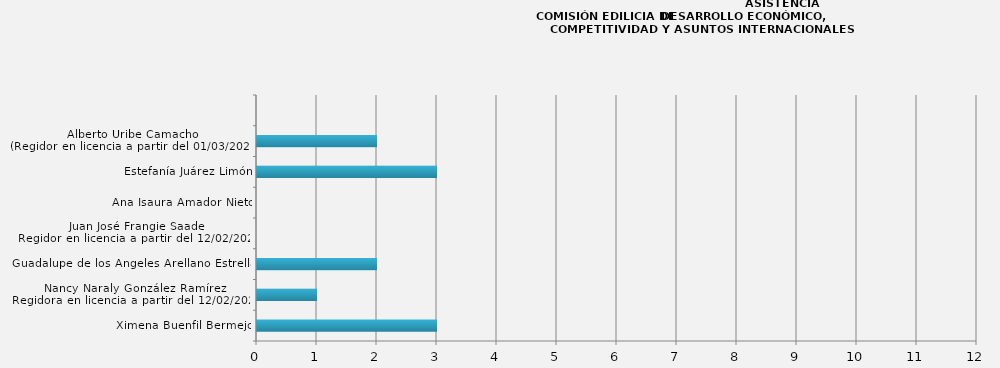
| Category | Ximena Buenfil Bermejo |
|---|---|
| Ximena Buenfil Bermejo | 3 |
| Nancy Naraly González Ramírez
Regidora en licencia a partir del 12/02/2024 | 1 |
| Guadalupe de los Ángeles Arellano Estrella  | 2 |
| Juan José Frangie Saade
Regidor en licencia a partir del 12/02/2024 | 0 |
| Ana Isaura Amador Nieto | 0 |
| Estefanía Juárez Limón | 3 |
| Alberto Uribe Camacho
(Regidor en licencia a partir del 01/03/2024) | 2 |